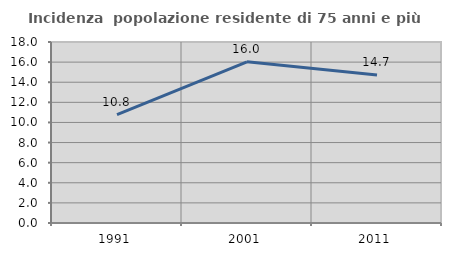
| Category | Incidenza  popolazione residente di 75 anni e più |
|---|---|
| 1991.0 | 10.774 |
| 2001.0 | 16.024 |
| 2011.0 | 14.721 |